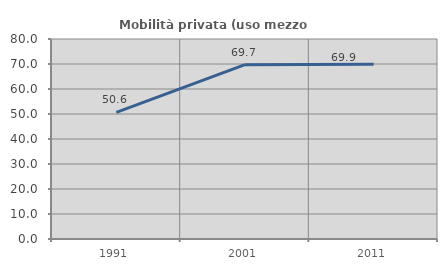
| Category | Mobilità privata (uso mezzo privato) |
|---|---|
| 1991.0 | 50.639 |
| 2001.0 | 69.729 |
| 2011.0 | 69.907 |